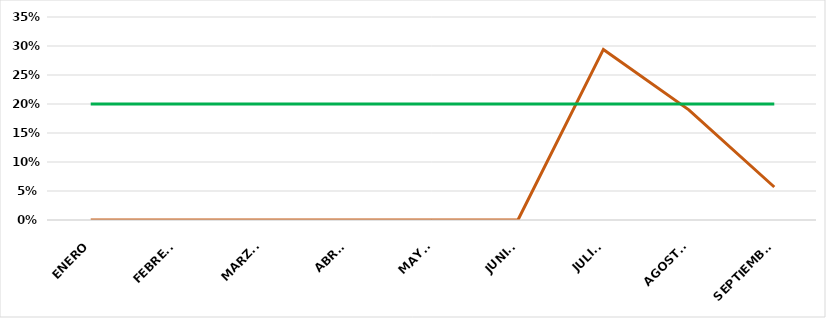
| Category | VALOR  | META PONDERADA |
|---|---|---|
| ENERO | 0 | 0.2 |
| FEBRERO | 0 | 0.2 |
| MARZO | 0 | 0.2 |
| ABRIL | 0 | 0.2 |
| MAYO | 0 | 0.2 |
| JUNIO | 0 | 0.2 |
| JULIO | 0.294 | 0.2 |
| AGOSTO | 0.19 | 0.2 |
| SEPTIEMBRE | 0.057 | 0.2 |